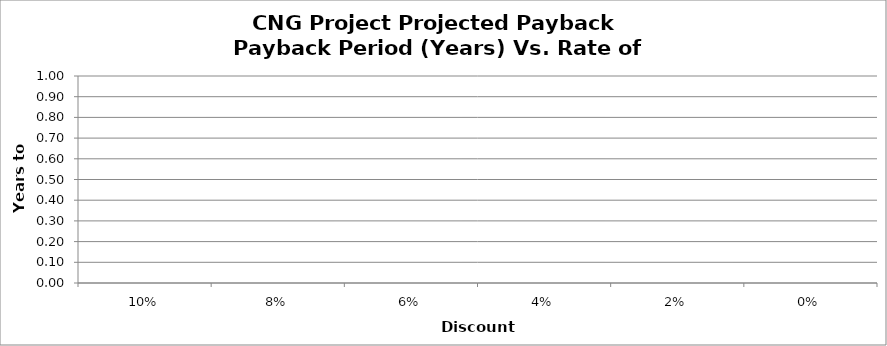
| Category | Series 0 |
|---|---|
| 0.1 | 0 |
| 0.08 | 0 |
| 0.06 | 0 |
| 0.039999999999999994 | 0 |
| 0.019999999999999997 | 0 |
| 0.0 | 0 |